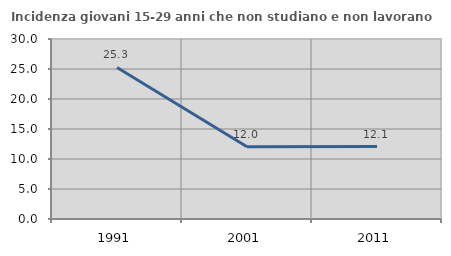
| Category | Incidenza giovani 15-29 anni che non studiano e non lavorano  |
|---|---|
| 1991.0 | 25.255 |
| 2001.0 | 12.038 |
| 2011.0 | 12.073 |